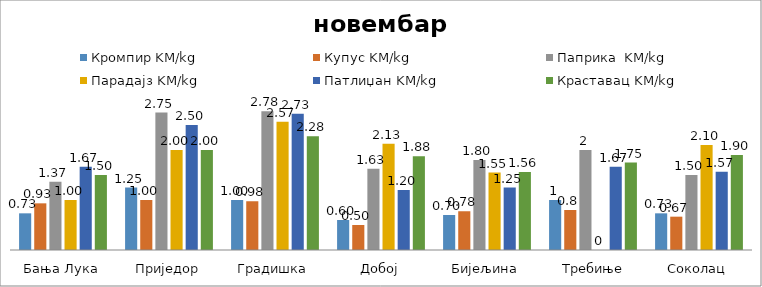
| Category | Кромпир KM/kg | Купус KM/kg | Паприка  KM/kg | Парадајз KM/kg | Патлиџан KM/kg | Краставац KM/kg |
|---|---|---|---|---|---|---|
| Бања Лука | 0.733 | 0.933 | 1.367 | 1 | 1.667 | 1.5 |
| Приједор | 1.25 | 1 | 2.75 | 2 | 2.5 | 2 |
| Градишка | 1 | 0.975 | 2.775 | 2.567 | 2.725 | 2.275 |
| Добој | 0.6 | 0.5 | 1.625 | 2.125 | 1.2 | 1.875 |
| Бијељина | 0.7 | 0.775 | 1.8 | 1.55 | 1.25 | 1.562 |
|  Требиње | 1 | 0.8 | 2 | 0 | 1.667 | 1.75 |
| Соколац | 0.733 | 0.667 | 1.5 | 2.1 | 1.567 | 1.9 |